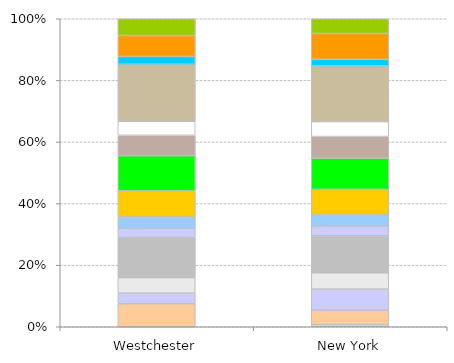
| Category | Agriculture / Mining / Utilities | Construction | Manufacturing | Wholesale Trade | Retail Trade | Transportation / Warehousing | Information | Finance, Insurance & Real Estate | Professional Svcs & Management | Administrative | Education | Health Care | Arts & Entertainment | Accomodation & Food Services | Other Services |
|---|---|---|---|---|---|---|---|---|---|---|---|---|---|---|---|
| Westchester | 54 | 29279 | 13568 | 19821 | 50906 | 11830 | 14692 | 33182 | 44888 | 26001 | 18047 | 72622 | 9858 | 26769 | 21369 |
| New York | 47694 | 350934 | 511209 | 394390 | 892335 | 240237 | 289745 | 594917 | 758375 | 518877 | 361429 | 1345569 | 158890 | 626195 | 355505 |